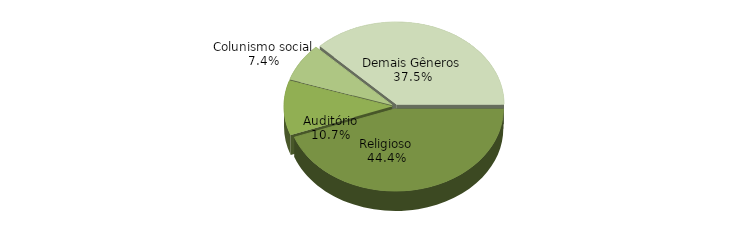
| Category | Series 0 |
|---|---|
| Religioso | 0.444 |
| Auditório | 0.107 |
| Colunismo social | 0.074 |
| Demais Gêneros | 0.375 |